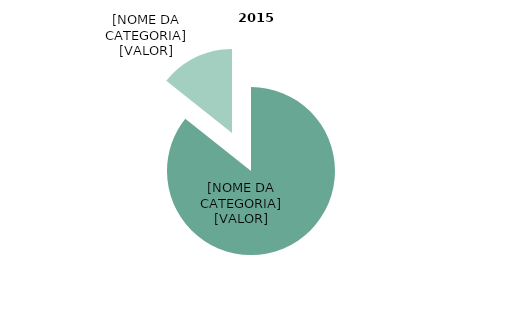
| Category | 2015 |
|---|---|
| DVD | 0.857 |
| Blu-ray | 0.143 |